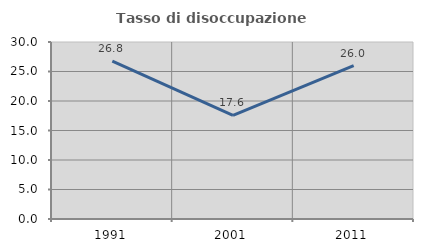
| Category | Tasso di disoccupazione giovanile  |
|---|---|
| 1991.0 | 26.752 |
| 2001.0 | 17.582 |
| 2011.0 | 26 |